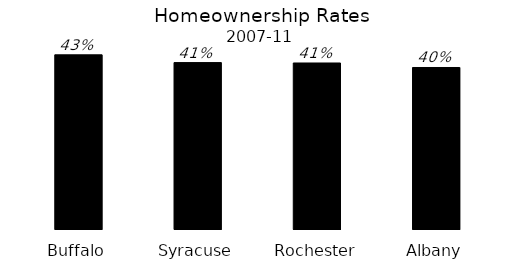
| Category | Series 0 |
|---|---|
| Buffalo | 0.426 |
| Syracuse | 0.407 |
| Rochester | 0.406 |
| Albany | 0.395 |